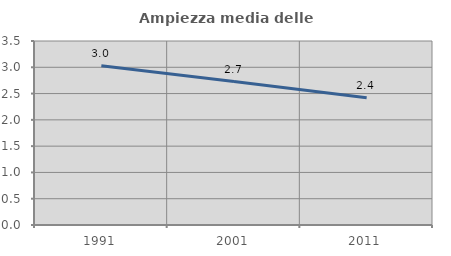
| Category | Ampiezza media delle famiglie |
|---|---|
| 1991.0 | 3.031 |
| 2001.0 | 2.729 |
| 2011.0 | 2.42 |